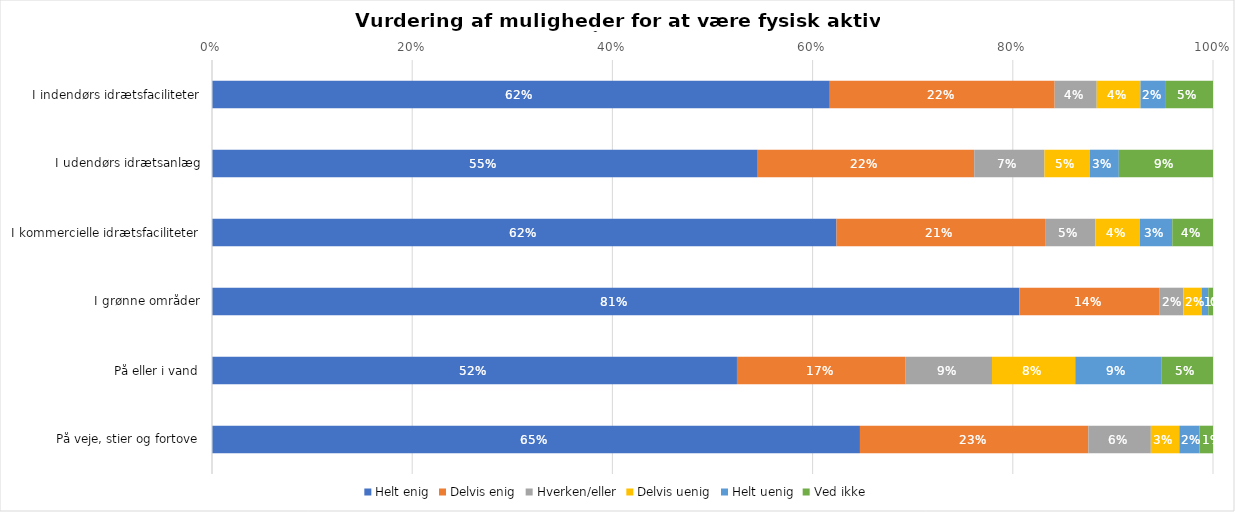
| Category | Helt enig | Delvis enig | Hverken/eller | Delvis uenig | Helt uenig | Ved ikke |
|---|---|---|---|---|---|---|
| I indendørs idrætsfaciliteter | 0.617 | 0.225 | 0.042 | 0.044 | 0.025 | 0.048 |
| I udendørs idrætsanlæg | 0.545 | 0.216 | 0.07 | 0.046 | 0.029 | 0.094 |
| I kommercielle idrætsfaciliteter | 0.624 | 0.208 | 0.05 | 0.045 | 0.032 | 0.041 |
| I grønne områder | 0.807 | 0.14 | 0.024 | 0.018 | 0.007 | 0.005 |
| På eller i vand | 0.524 | 0.168 | 0.087 | 0.083 | 0.086 | 0.052 |
| På veje, stier og fortove | 0.647 | 0.228 | 0.062 | 0.028 | 0.02 | 0.013 |